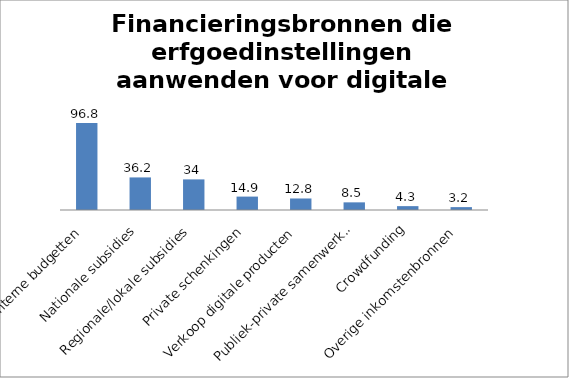
| Category | Series 0 |
|---|---|
| Interne budgetten | 96.8 |
| Nationale subsidies | 36.2 |
| Regionale/lokale subsidies | 34 |
| Private schenkingen | 14.9 |
| Verkoop digitale producten | 12.8 |
| Publiek-private samenwerking | 8.5 |
| Crowdfunding | 4.3 |
| Overige inkomstenbronnen | 3.2 |